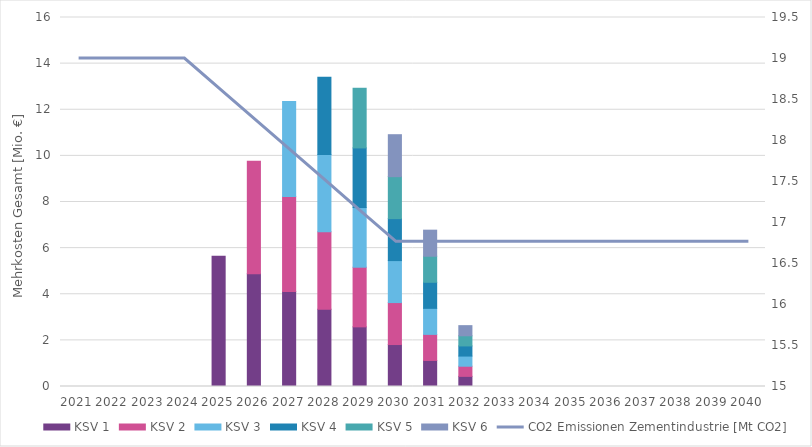
| Category | KSV 1 | KSV 2 | KSV 3 | KSV 4 | KSV 5 | KSV 6 |
|---|---|---|---|---|---|---|
| 0 | 0 | 0 | 0 | 0 | 0 | 0 |
| 1 | 0 | 0 | 0 | 0 | 0 | 0 |
| 2 | 0 | 0 | 0 | 0 | 0 | 0 |
| 3 | 0 | 0 | 0 | 0 | 0 | 0 |
| 4 | 5.653 | 0 | 0 | 0 | 0 | 0 |
| 5 | 4.886 | 4.886 | 0 | 0 | 0 | 0 |
| 6 | 4.12 | 4.12 | 4.12 | 0 | 0 | 0 |
| 7 | 3.353 | 3.353 | 3.353 | 3.353 | 0 | 0 |
| 8 | 2.586 | 2.586 | 2.586 | 2.586 | 2.586 | 0 |
| 9 | 1.82 | 1.82 | 1.82 | 1.82 | 1.82 | 1.82 |
| 10 | 1.13 | 1.13 | 1.13 | 1.13 | 1.13 | 1.13 |
| 11 | 0.44 | 0.44 | 0.44 | 0.44 | 0.44 | 0.44 |
| 12 | 0 | 0 | 0 | 0 | 0 | 0 |
| 13 | 0 | 0 | 0 | 0 | 0 | 0 |
| 14 | 0 | 0 | 0 | 0 | 0 | 0 |
| 15 | 0 | 0 | 0 | 0 | 0 | 0 |
| 16 | 0 | 0 | 0 | 0 | 0 | 0 |
| 17 | 0 | 0 | 0 | 0 | 0 | 0 |
| 18 | 0 | 0 | 0 | 0 | 0 | 0 |
| 19 | 0 | 0 | 0 | 0 | 0 | 0 |